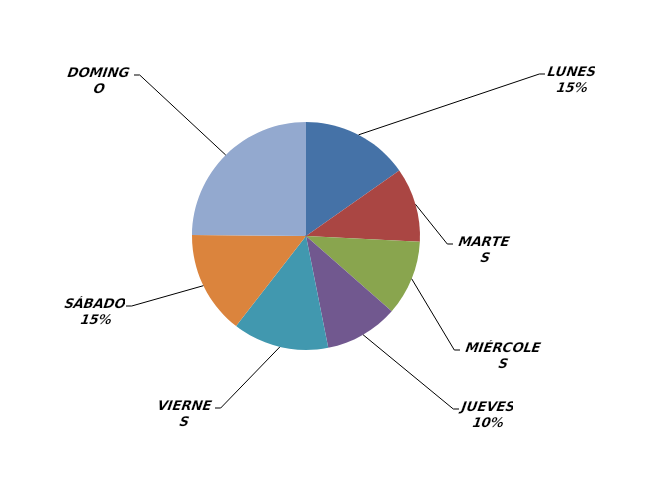
| Category | Series 0 |
|---|---|
| LUNES | 246 |
| MARTES | 170 |
| MIÉRCOLES | 172 |
| JUEVES | 168 |
| VIERNES | 220 |
| SÁBADO | 236 |
| DOMINGO | 401 |